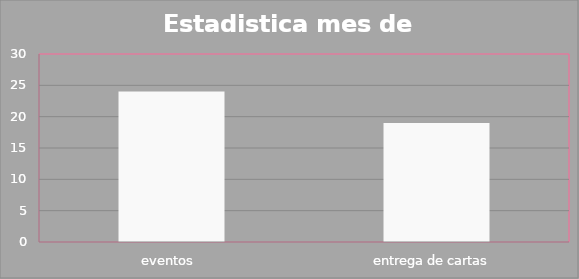
| Category | Series 0 |
|---|---|
| eventos  | 24 |
| entrega de cartas  | 19 |